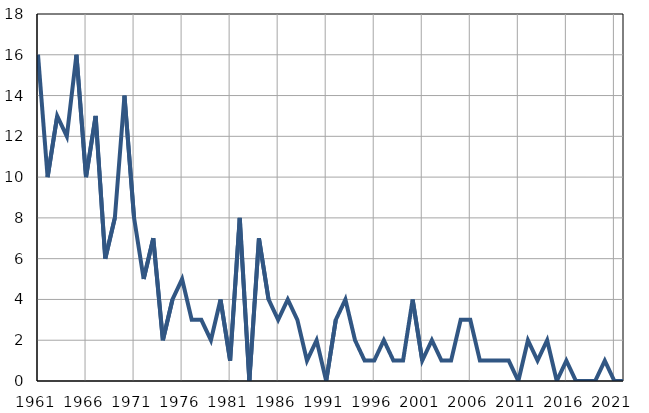
| Category | Infants
deaths |
|---|---|
| 1961.0 | 16 |
| 1962.0 | 10 |
| 1963.0 | 13 |
| 1964.0 | 12 |
| 1965.0 | 16 |
| 1966.0 | 10 |
| 1967.0 | 13 |
| 1968.0 | 6 |
| 1969.0 | 8 |
| 1970.0 | 14 |
| 1971.0 | 8 |
| 1972.0 | 5 |
| 1973.0 | 7 |
| 1974.0 | 2 |
| 1975.0 | 4 |
| 1976.0 | 5 |
| 1977.0 | 3 |
| 1978.0 | 3 |
| 1979.0 | 2 |
| 1980.0 | 4 |
| 1981.0 | 1 |
| 1982.0 | 8 |
| 1983.0 | 0 |
| 1984.0 | 7 |
| 1985.0 | 4 |
| 1986.0 | 3 |
| 1987.0 | 4 |
| 1988.0 | 3 |
| 1989.0 | 1 |
| 1990.0 | 2 |
| 1991.0 | 0 |
| 1992.0 | 3 |
| 1993.0 | 4 |
| 1994.0 | 2 |
| 1995.0 | 1 |
| 1996.0 | 1 |
| 1997.0 | 2 |
| 1998.0 | 1 |
| 1999.0 | 1 |
| 2000.0 | 4 |
| 2001.0 | 1 |
| 2002.0 | 2 |
| 2003.0 | 1 |
| 2004.0 | 1 |
| 2005.0 | 3 |
| 2006.0 | 3 |
| 2007.0 | 1 |
| 2008.0 | 1 |
| 2009.0 | 1 |
| 2010.0 | 1 |
| 2011.0 | 0 |
| 2012.0 | 2 |
| 2013.0 | 1 |
| 2014.0 | 2 |
| 2015.0 | 0 |
| 2016.0 | 1 |
| 2017.0 | 0 |
| 2018.0 | 0 |
| 2019.0 | 0 |
| 2020.0 | 1 |
| 2021.0 | 0 |
| 2022.0 | 0 |